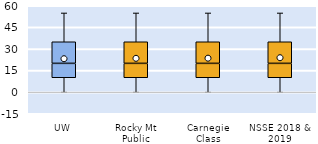
| Category | 25th | 50th | 75th |
|---|---|---|---|
| UW | 10 | 10 | 15 |
| Rocky Mt Public | 10 | 10 | 15 |
| Carnegie Class | 10 | 10 | 15 |
| NSSE 2018 & 2019 | 10 | 10 | 15 |